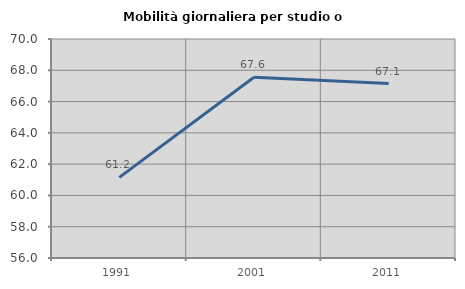
| Category | Mobilità giornaliera per studio o lavoro |
|---|---|
| 1991.0 | 61.154 |
| 2001.0 | 67.555 |
| 2011.0 | 67.149 |